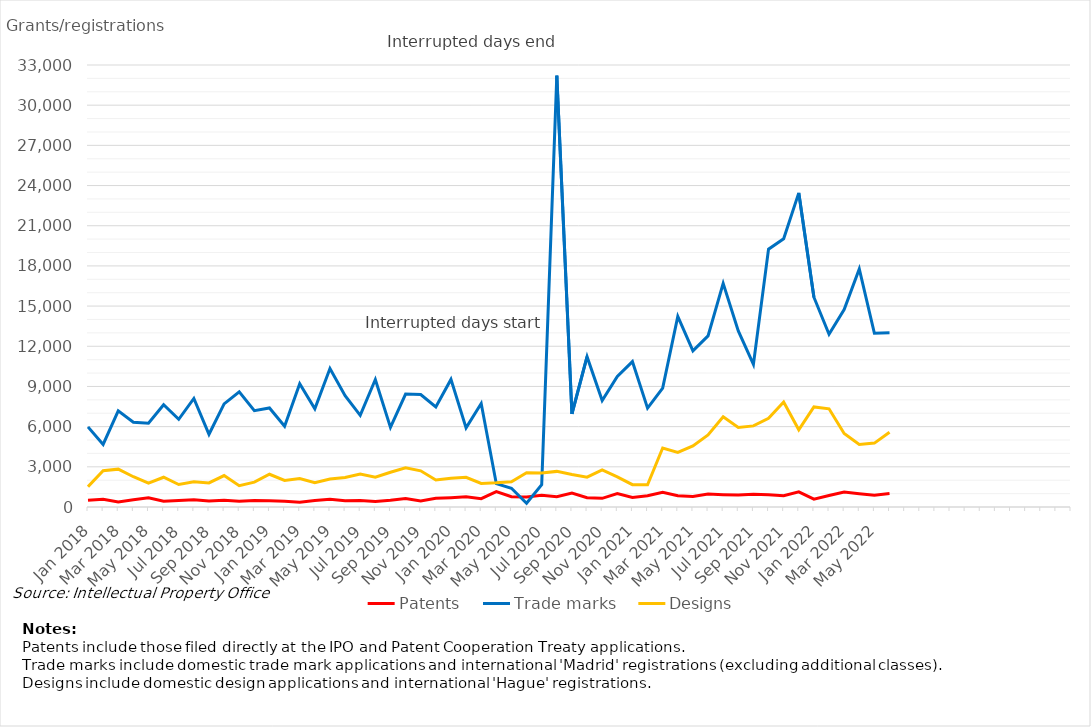
| Category | Patents | Trade marks | Designs |
|---|---|---|---|
| Jan 2018 | 495 | 5979 | 1512 |
| Feb 2018 | 574 | 4672 | 2704 |
| Mar 2018 | 370 | 7178 | 2825 |
| Apr 2018 | 543 | 6333 | 2259 |
| May 2018 | 690 | 6252 | 1789 |
| Jun 2018 | 424 | 7636 | 2222 |
| Jul 2018 | 486 | 6548 | 1678 |
| Aug 2018 | 536 | 8104 | 1878 |
| Sep 2018 | 450 | 5429 | 1795 |
| Oct 2018 | 498 | 7701 | 2348 |
| Nov 2018 | 432 | 8603 | 1592 |
| Dec 2018 | 484 | 7190 | 1859 |
| Jan 2019 | 474 | 7392 | 2444 |
| Feb 2019 | 426 | 6023 | 1987 |
| Mar 2019 | 363 | 9201 | 2125 |
| Apr 2019 | 488 | 7336 | 1810 |
| May 2019 | 573 | 10344 | 2096 |
| Jun 2019 | 471 | 8304 | 2202 |
| Jul 2019 | 489 | 6839 | 2464 |
| Aug 2019 | 420 | 9517 | 2218 |
| Sep 2019 | 500 | 5943 | 2596 |
| Oct 2019 | 634 | 8435 | 2926 |
| Nov 2019 | 455 | 8400 | 2700 |
| Dec 2019 | 654 | 7465 | 2021 |
| Jan 2020 | 696 | 9525 | 2145 |
| Feb 2020 | 756 | 5908 | 2220 |
| Mar 2020 | 622 | 7722 | 1757 |
| Apr 2020 | 1143 | 1742 | 1803 |
| May 2020 | 768 | 1399 | 1888 |
| Jun 2020 | 740 | 280 | 2564 |
| Jul 2020 | 878 | 1659 | 2539 |
| Aug 2020 | 771 | 32204 | 2659 |
| Sep 2020 | 1042 | 6947 | 2425 |
| Oct 2020 | 697 | 11221 | 2223 |
| Nov 2020 | 649 | 7954 | 2763 |
| Dec 2020 | 1010 | 9749 | 2252 |
| Jan 2021 | 708 | 10856 | 1665 |
| Feb 2021 | 838 | 7380 | 1660 |
| Mar 2021 | 1107 | 8877 | 4408 |
| Apr 2021 | 838 | 14232 | 4075 |
| May 2021 | 788 | 11653 | 4562 |
| Jun 2021 | 972 | 12772 | 5385 |
| Jul 2021 | 918 | 16695 | 6732 |
| Aug 2021 | 887 | 13145 | 5944 |
| Sep 2021 | 947 | 10649 | 6055 |
| Oct 2021 | 920 | 19251 | 6626 |
| Nov 2021 | 841 | 20029 | 7839 |
| Dec 2021 | 1131 | 23453 | 5765 |
| Jan 2022 | 585 | 15662 | 7468 |
| Feb 2022 | 860 | 12894 | 7331 |
| Mar 2022 | 1111 | 14745 | 5483 |
| Apr 2022 | 990 | 17778 | 4669 |
| May 2022 | 883 | 12970 | 4771 |
| June 2022 | 1010 | 13003 | 5583 |